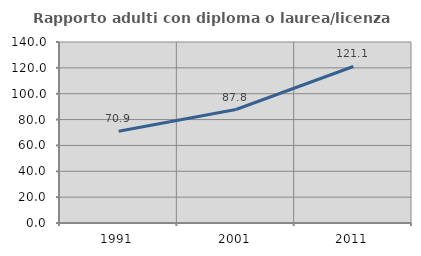
| Category | Rapporto adulti con diploma o laurea/licenza media  |
|---|---|
| 1991.0 | 70.892 |
| 2001.0 | 87.785 |
| 2011.0 | 121.062 |